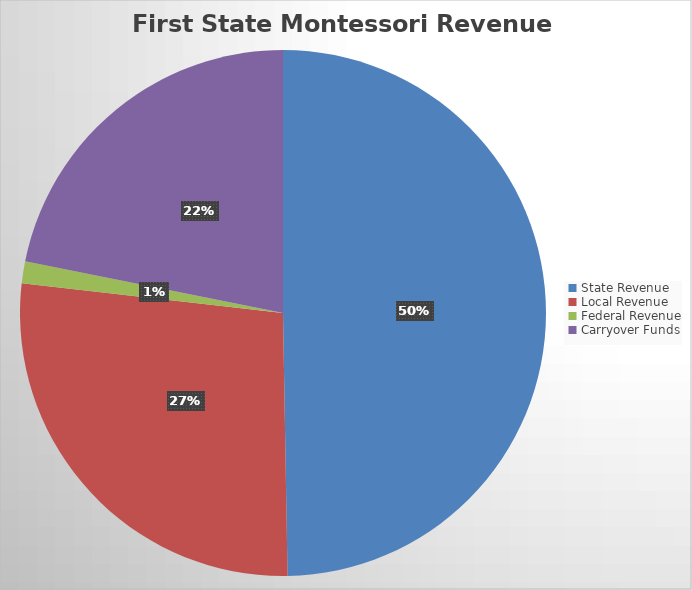
| Category | Series 0 |
|---|---|
| State Revenue | 6156643.24 |
| Local Revenue | 3352860.8 |
| Federal Revenue | 167344 |
| Carryover Funds | 2704941.32 |